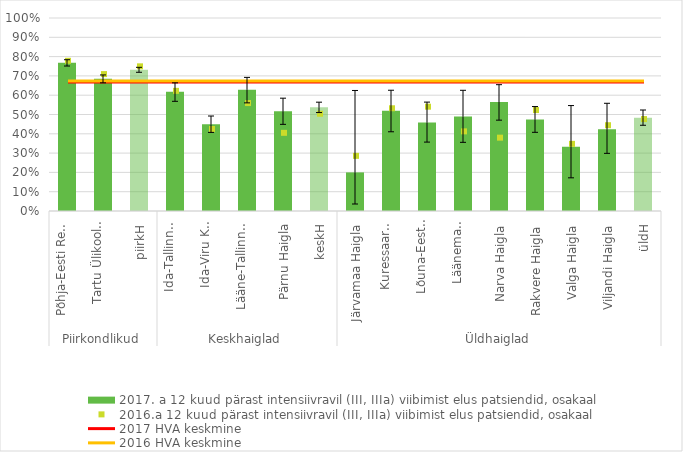
| Category | 2017. a 12 kuud pärast intensiivravil (III, IIIa) viibimist elus patsiendid, osakaal |
|---|---|
| 0 | 0.768 |
| 1 | 0.685 |
| 2 | 0.732 |
| 3 | 0.617 |
| 4 | 0.449 |
| 5 | 0.629 |
| 6 | 0.517 |
| 7 | 0.537 |
| 8 | 0.2 |
| 9 | 0.519 |
| 10 | 0.459 |
| 11 | 0.49 |
| 12 | 0.565 |
| 13 | 0.474 |
| 14 | 0.333 |
| 15 | 0.423 |
| 16 | 0.484 |